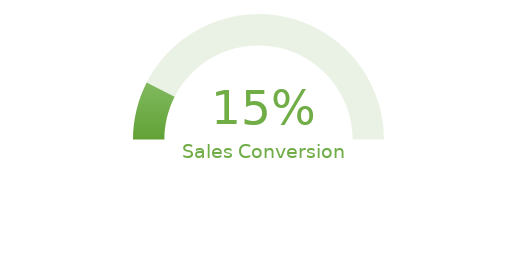
| Category | Sales Conversion |
|---|---|
| 0 | 0.15 |
| 1 | 0.85 |
| 2 | 1 |